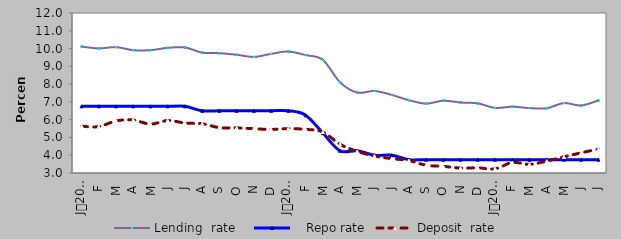
| Category | Lending  rate |    Repo rate | Deposit  rate |
|---|---|---|---|
| 0 | 10.11 | 6.75 | 5.63 |
| 1900-01-01 | 10.01 | 6.75 | 5.61 |
| 1900-01-02 | 10.08 | 6.75 | 5.93 |
| 1900-01-03 | 9.91 | 6.75 | 5.98 |
| 1900-01-04 | 9.91 | 6.75 | 5.75 |
| 1900-01-05 | 10.04 | 6.75 | 5.95 |
| 1900-01-06 | 10.06 | 6.75 | 5.813 |
| 1900-01-07 | 9.77 | 6.5 | 5.77 |
| 1900-01-08 | 9.74 | 6.5 | 5.55 |
| 1900-01-09 | 9.65 | 6.5 | 5.54 |
| 1900-01-10 | 9.53 | 6.5 | 5.49 |
| 1900-01-11 | 9.7 | 6.5 | 5.45 |
| 1900-01-12 | 9.833 | 6.5 | 5.497 |
| 1900-01-13 | 9.634 | 6.25 | 5.454 |
| 1900-01-14 | 9.369 | 5.25 | 5.304 |
| 1900-01-15 | 8.106 | 4.25 | 4.617 |
| 1900-01-16 | 7.526 | 4.25 | 4.216 |
| 1900-01-17 | 7.616 | 4 | 3.953 |
| 1900-01-18 | 7.394 | 4 | 3.809 |
| 1900-01-19 | 7.095 | 3.75 | 3.699 |
| 1900-01-20 | 6.902 | 3.75 | 3.437 |
| 1900-01-21 | 7.067 | 3.75 | 3.374 |
| 1900-01-22 | 6.965 | 3.75 | 3.276 |
| 1900-01-23 | 6.917 | 3.75 | 3.292 |
| 1900-01-24 | 6.663 | 3.75 | 3.236 |
| 1900-01-25 | 6.731 | 3.75 | 3.592 |
| 1900-01-26 | 6.653 | 3.75 | 3.488 |
| 1900-01-27 | 6.64 | 3.75 | 3.667 |
| 1900-01-28 | 6.933 | 3.75 | 3.907 |
| 1900-01-29 | 6.798 | 3.75 | 4.137 |
| 1900-01-30 | 7.081 | 3.75 | 4.347 |